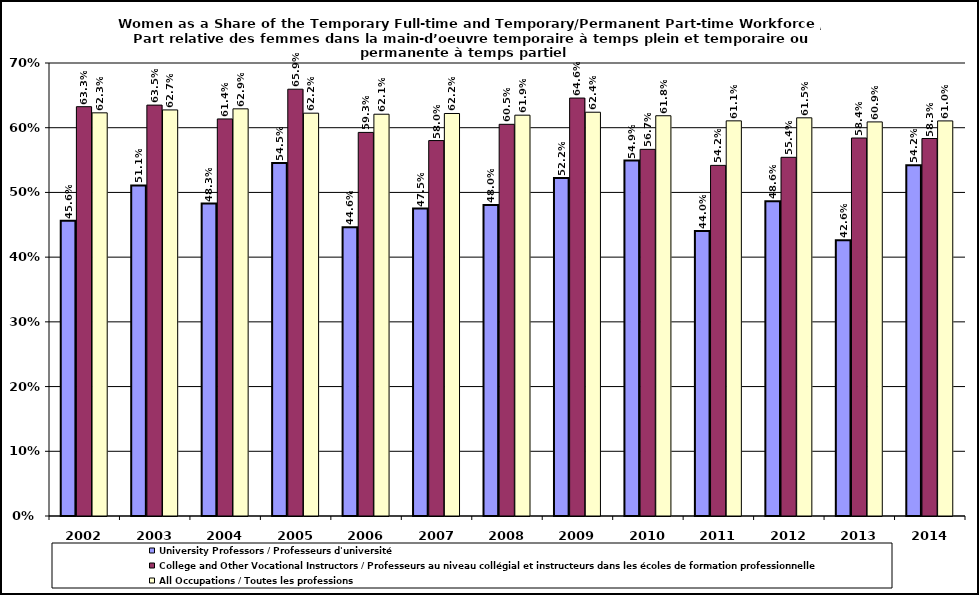
| Category | University Professors / Professeurs d'université | College and Other Vocational Instructors / Professeurs au niveau collégial et instructeurs dans les écoles de formation professionnelle  | All Occupations / Toutes les professions |
|---|---|---|---|
| 2002.0 | 0.456 | 0.633 | 0.623 |
| 2003.0 | 0.511 | 0.635 | 0.627 |
| 2004.0 | 0.483 | 0.614 | 0.629 |
| 2005.0 | 0.545 | 0.659 | 0.622 |
| 2006.0 | 0.446 | 0.593 | 0.621 |
| 2007.0 | 0.475 | 0.58 | 0.622 |
| 2008.0 | 0.48 | 0.605 | 0.619 |
| 2009.0 | 0.522 | 0.646 | 0.624 |
| 2010.0 | 0.549 | 0.567 | 0.618 |
| 2011.0 | 0.44 | 0.542 | 0.611 |
| 2012.0 | 0.486 | 0.554 | 0.615 |
| 2013.0 | 0.426 | 0.584 | 0.609 |
| 2014.0 | 0.542 | 0.583 | 0.61 |